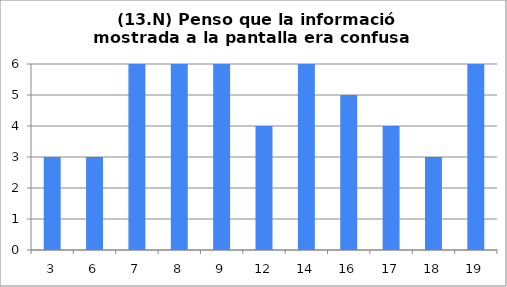
| Category | 13 |
|---|---|
| 3.0 | 3 |
| 6.0 | 3 |
| 7.0 | 6 |
| 8.0 | 6 |
| 9.0 | 6 |
| 12.0 | 4 |
| 14.0 | 6 |
| 16.0 | 5 |
| 17.0 | 4 |
| 18.0 | 3 |
| 19.0 | 6 |